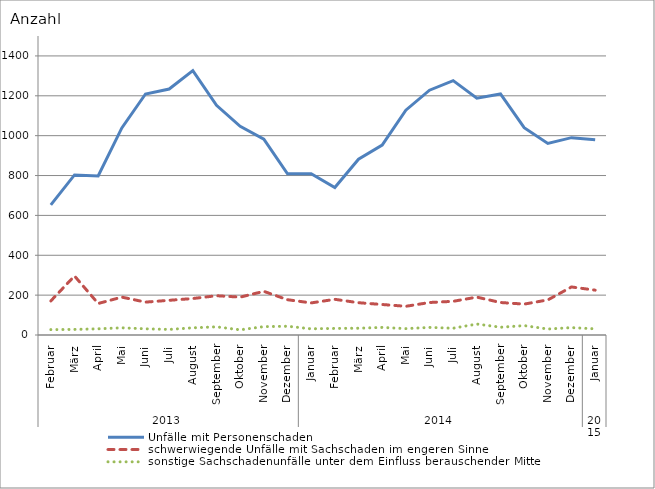
| Category | Unfälle mit Personenschaden | schwerwiegende Unfälle mit Sachschaden im engeren Sinne | sonstige Sachschadenunfälle unter dem Einfluss berauschender Mittel |
|---|---|---|---|
| 0 | 653 | 171 | 27 |
| 1 | 803 | 296 | 28 |
| 2 | 798 | 158 | 31 |
| 3 | 1039 | 190 | 36 |
| 4 | 1209 | 165 | 31 |
| 5 | 1234 | 174 | 28 |
| 6 | 1326 | 183 | 36 |
| 7 | 1152 | 197 | 41 |
| 8 | 1047 | 190 | 26 |
| 9 | 983 | 219 | 42 |
| 10 | 809 | 177 | 44 |
| 11 | 809 | 161 | 31 |
| 12 | 740 | 179 | 33 |
| 13 | 882 | 162 | 34 |
| 14 | 953 | 153 | 38 |
| 15 | 1128 | 144 | 32 |
| 16 | 1228 | 163 | 38 |
| 17 | 1276 | 169 | 34 |
| 18 | 1188 | 190 | 55 |
| 19 | 1209 | 163 | 39 |
| 20 | 1040 | 155 | 47 |
| 21 | 961 | 176 | 30 |
| 22 | 990 | 241 | 37 |
| 23 | 980 | 225 | 31 |